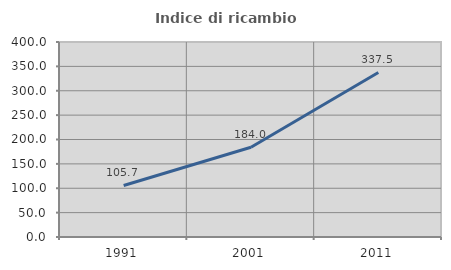
| Category | Indice di ricambio occupazionale  |
|---|---|
| 1991.0 | 105.714 |
| 2001.0 | 184 |
| 2011.0 | 337.5 |